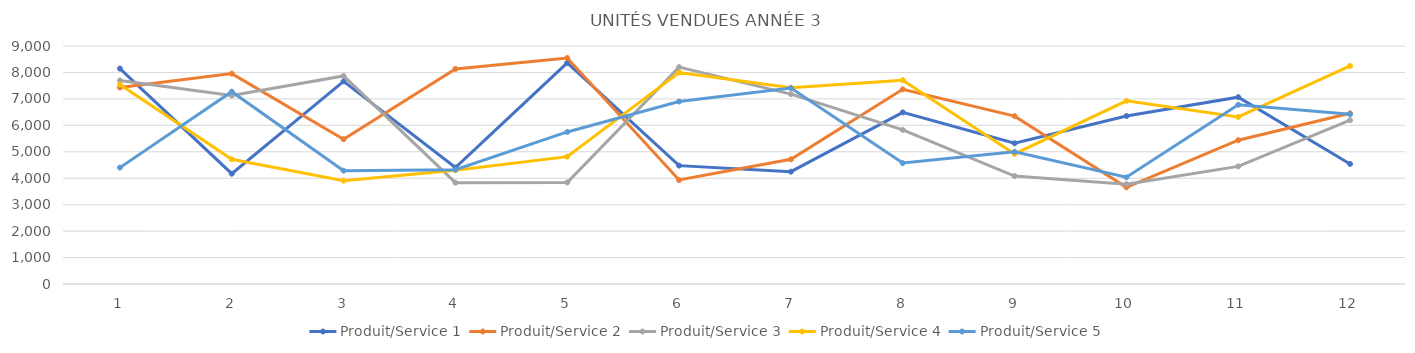
| Category | Produit/Service 1 | Produit/Service 2 | Produit/Service 3 | Produit/Service 4 | Produit/Service 5 |
|---|---|---|---|---|---|
| 0 | 8146 | 7430 | 7694 | 7544 | 4401 |
| 1 | 4171 | 7956 | 7127 | 4716 | 7273 |
| 2 | 7662 | 5475 | 7868 | 3907 | 4286 |
| 3 | 4404 | 8133 | 3831 | 4302 | 4322 |
| 4 | 8362 | 8546 | 3840 | 4816 | 5750 |
| 5 | 4476 | 3933 | 8201 | 7998 | 6900 |
| 6 | 4247 | 4715 | 7181 | 7419 | 7411 |
| 7 | 6489 | 7362 | 5828 | 7707 | 4573 |
| 8 | 5323 | 6348 | 4082 | 4919 | 4999 |
| 9 | 6351 | 3656 | 3773 | 6927 | 4036 |
| 10 | 7065 | 5437 | 4447 | 6317 | 6777 |
| 11 | 4540 | 6454 | 6195 | 8245 | 6421 |